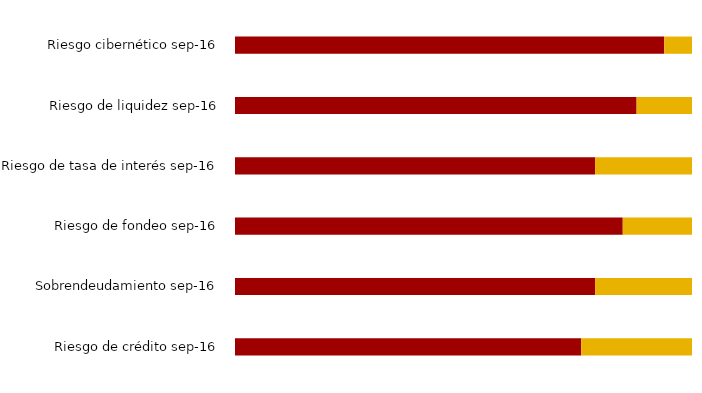
| Category | Controlado | Afecta las operaciones de la entidad |
|---|---|---|
| Riesgo de crédito sep-16 | 0.758 | 0.242 |
| Sobrendeudamiento sep-16 | 0.788 | 0.212 |
| Riesgo de fondeo sep-16 | 0.848 | 0.152 |
| Riesgo de tasa de interés sep-16 | 0.788 | 0.212 |
| Riesgo de liquidez sep-16 | 0.879 | 0.121 |
| Riesgo cibernético sep-16 | 0.939 | 0.061 |